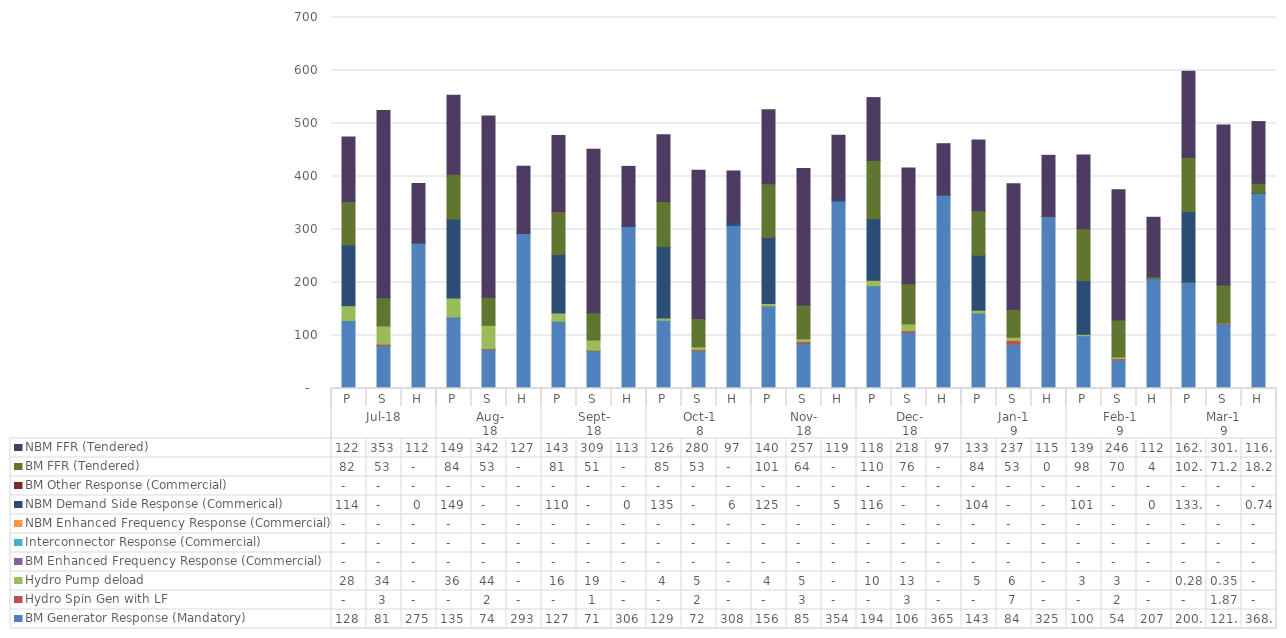
| Category | BM Generator Response (Mandatory)  | Hydro Spin Gen with LF | Hydro Pump deload | BM Enhanced Frequency Response (Commercial) | Interconnector Response (Commercial) | NBM Enhanced Frequency Response (Commercial) | NBM Demand Side Response (Commerical) | BM Other Response (Commercial) | BM FFR (Tendered) | NBM FFR (Tendered) |
|---|---|---|---|---|---|---|---|---|---|---|
| 0 | 128.375 | 0 | 27.768 | 0 | 0 | 0 | 114.48 | 0 | 82.286 | 121.842 |
| 1 | 80.726 | 3.021 | 34.38 | 0 | 0 | 0 | 0 | 0 | 53.051 | 353.327 |
| 2 | 274.728 | 0 | 0 | 0 | 0 | 0 | 0.08 | 0 | 0 | 111.977 |
| 3 | 135.028 | 0 | 35.523 | 0 | 0 | 0 | 149.266 | 0 | 84.286 | 149.094 |
| 4 | 73.519 | 1.671 | 44.088 | 0 | 0 | 0 | 0 | 0 | 53.051 | 341.977 |
| 5 | 292.608 | 0 | 0 | 0 | 0 | 0 | 0 | 0 | 0 | 126.807 |
| 6 | 126.998 | 0 | 15.567 | 0 | 0 | 0 | 110.142 | 0 | 81.43 | 143.008 |
| 7 | 70.855 | 1.43 | 19.274 | 0 | 0 | 0 | 0 | 0 | 51.253 | 308.517 |
| 8 | 305.858 | 0 | 0 | 0 | 0 | 0 | 0.464 | 0 | 0 | 112.847 |
| 9 | 128.649 | 0 | 4.324 | 0 | 0 | 0 | 135.143 | 0 | 84.541 | 126.083 |
| 10 | 71.609 | 1.717 | 5.353 | 0 | 0 | 0 | 0 | 0 | 53.211 | 280.068 |
| 11 | 307.77 | 0 | 0 | 0 | 0 | 0 | 5.87 | 0 | 0 | 96.794 |
| 12 | 155.841 | 0 | 4.374 | 0 | 0 | 0 | 124.939 | 0 | 101.15 | 139.64 |
| 13 | 85.417 | 3.076 | 5.416 | 0 | 0 | 0 | 0 | 0 | 63.665 | 257.444 |
| 14 | 353.718 | 0 | 0 | 0 | 0 | 0 | 4.926 | 0 | 0 | 119.221 |
| 15 | 193.772 | 0 | 10.41 | 0 | 0 | 0 | 116.13 | 0 | 110.15 | 118.396 |
| 16 | 105.922 | 3.047 | 12.882 | 0 | 0 | 0 | 0 | 0 | 75.647 | 218.339 |
| 17 | 364.922 | 0 | 0 | 0 | 0 | 0 | 0 | 0 | 0 | 96.976 |
| 18 | 142.647 | 0 | 5.13 | 0 | 0 | 0 | 103.543 | 0 | 84.041 | 133.276 |
| 19 | 83.924 | 6.584 | 6.352 | 0 | 0 | 0 | 0 | 0 | 52.9 | 236.637 |
| 20 | 324.98 | 0 | 0 | 0 | 0 | 0 | 0 | 0 | 0.01 | 114.985 |
| 21 | 99.68 | 0 | 2.625 | 0 | 0 | 0 | 101.216 | 0 | 97.894 | 139.308 |
| 22 | 54.049 | 2.253 | 3.25 | 0 | 0 | 0 | 0 | 0 | 69.645 | 245.709 |
| 23 | 207.343 | 0 | 0 | 0 | 0 | 0 | 0.124 | 0 | 3.578 | 112.028 |
| 24 | 200.32 | 0 | 0.284 | 0 | 0 | 0 | 133.133 | 0 | 102.426 | 162.297 |
| 25 | 121.963 | 1.869 | 0.351 | 0 | 0 | 0 | 0 | 0 | 71.222 | 301.613 |
| 26 | 368.194 | 0 | 0 | 0 | 0 | 0 | 0.744 | 0 | 18.225 | 116.446 |